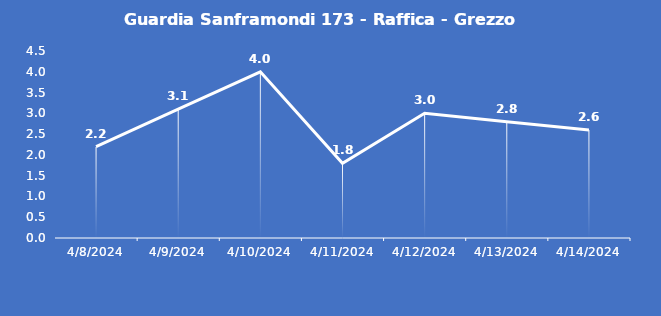
| Category | Guardia Sanframondi 173 - Raffica - Grezzo (m/s) |
|---|---|
| 4/8/24 | 2.2 |
| 4/9/24 | 3.1 |
| 4/10/24 | 4 |
| 4/11/24 | 1.8 |
| 4/12/24 | 3 |
| 4/13/24 | 2.8 |
| 4/14/24 | 2.6 |